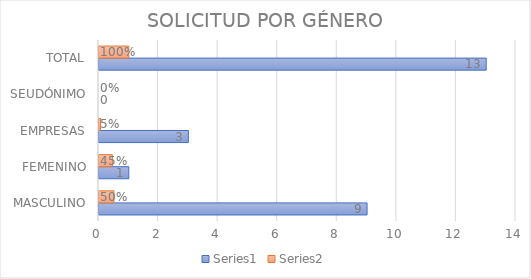
| Category | Series 0 | Series 1 |
|---|---|---|
| MASCULINO | 9 | 0.5 |
| FEMENINO | 1 | 0.45 |
| EMPRESAS | 3 | 0.05 |
| SEUDÓNIMO | 0 | 0 |
| TOTAL | 13 | 1 |